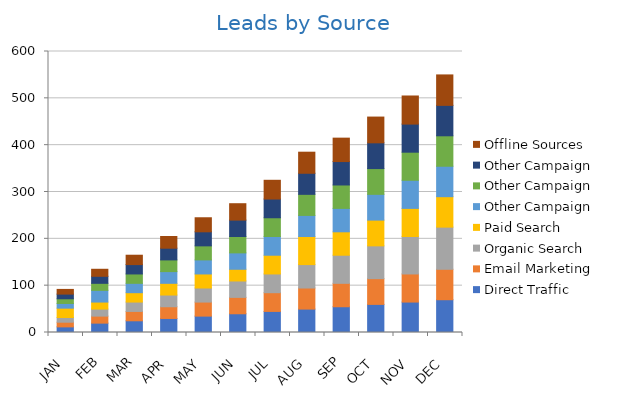
| Category | Direct Traffic | Email Marketing | Organic Search | Paid Search | Other Campaign  | Other Campaign | Offline Sources |
|---|---|---|---|---|---|---|---|
| JAN | 12 | 10 | 10 | 20 | 10 | 10 | 10 |
| FEB | 20 | 15 | 15 | 15 | 25 | 15 | 15 |
| MAR | 25 | 20 | 20 | 20 | 20 | 20 | 20 |
| APR | 30 | 25 | 25 | 25 | 25 | 25 | 25 |
| MAY | 35 | 30 | 30 | 30 | 30 | 30 | 30 |
| JUN | 40 | 35 | 35 | 25 | 35 | 35 | 35 |
| JUL | 45 | 40 | 40 | 40 | 40 | 40 | 40 |
| AUG | 50 | 45 | 50 | 60 | 45 | 45 | 45 |
| SEP | 55 | 50 | 60 | 50 | 50 | 50 | 50 |
| OCT | 60 | 55 | 70 | 55 | 55 | 55 | 55 |
| NOV | 65 | 60 | 80 | 60 | 60 | 60 | 60 |
| DEC | 70 | 65 | 90 | 65 | 65 | 65 | 65 |